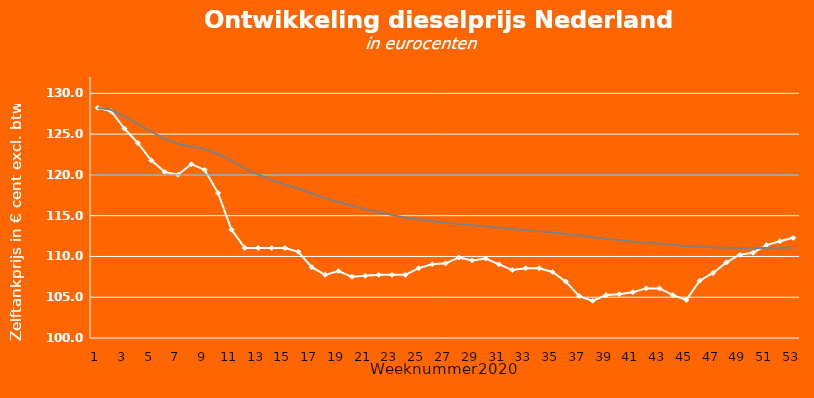
| Category | 1 |
|---|---|
| 1.0 | 128.23 |
| 2.0 | 127.982 |
| 3.0 | 127.134 |
| 4.0 | 126.266 |
| 5.0 | 125.315 |
| 6.0 | 124.449 |
| 7.0 | 123.789 |
| 8.0 | 123.468 |
| 9.0 | 123.14 |
| 10.0 | 122.587 |
| 11.0 | 121.719 |
| 12.0 | 120.807 |
| 13.0 | 120.039 |
| 14.0 | 119.383 |
| 15.0 | 118.816 |
| 16.0 | 118.291 |
| 17.0 | 117.716 |
| 18.0 | 117.153 |
| 19.0 | 116.675 |
| 20.0 | 116.21 |
| 21.0 | 115.795 |
| 22.0 | 115.424 |
| 23.0 | 115.086 |
| 24.0 | 114.776 |
| 25.0 | 114.525 |
| 26.0 | 114.311 |
| 27.0 | 114.118 |
| 28.0 | 113.965 |
| 29.0 | 113.81 |
| 30.0 | 113.673 |
| 31.0 | 113.522 |
| 32.0 | 113.358 |
| 33.0 | 113.211 |
| 34.0 | 113.073 |
| 35.0 | 112.93 |
| 36.0 | 112.761 |
| 37.0 | 112.554 |
| 38.0 | 112.341 |
| 39.0 | 112.158 |
| 40.0 | 111.988 |
| 41.0 | 111.831 |
| 42.0 | 111.693 |
| 43.0 | 111.562 |
| 44.0 | 111.417 |
| 45.0 | 111.267 |
| 46.0 | 111.174 |
| 47.0 | 111.105 |
| 48.0 | 111.067 |
| 49.0 | 111.05 |
| 50.0 | 111.038 |
| 51.0 | 111.045 |
| 52.0 | 111.061 |
| 53.0 | 111.074 |